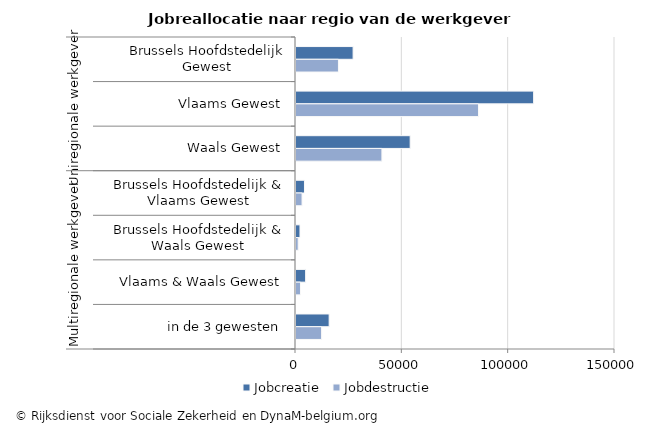
| Category | Jobcreatie | Jobdestructie |
|---|---|---|
| 0 | 26850 | 19958 |
| 1 | 111738 | 85811 |
| 2 | 53686 | 40396 |
| 3 | 3988 | 2844 |
| 4 | 1868 | 1030 |
| 5 | 4528 | 2112 |
| 6 | 15586 | 12039 |